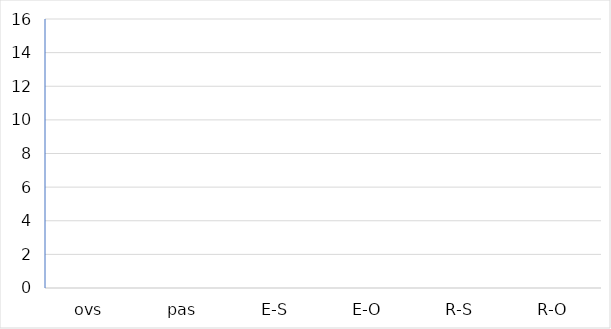
| Category | Series 1 |
|---|---|
| ovs | 0 |
| pas | 0 |
| E-S | 0 |
| E-O | 0 |
| R-S | 0 |
| R-O | 0 |